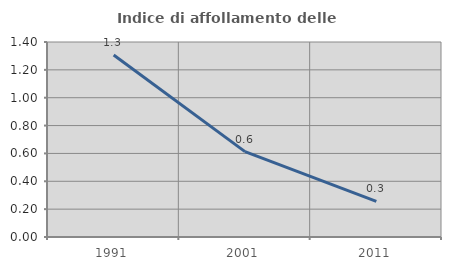
| Category | Indice di affollamento delle abitazioni  |
|---|---|
| 1991.0 | 1.307 |
| 2001.0 | 0.613 |
| 2011.0 | 0.256 |